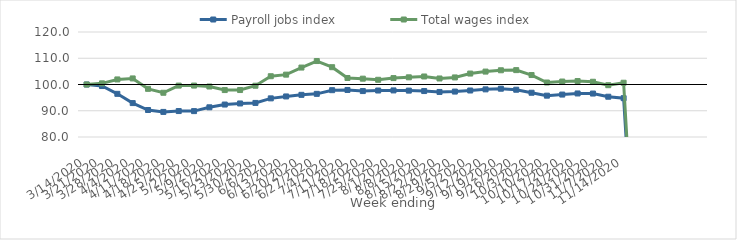
| Category | Payroll jobs index | Total wages index |
|---|---|---|
| 14/03/2020 | 100 | 100 |
| 21/03/2020 | 99.42 | 100.437 |
| 28/03/2020 | 96.446 | 101.93 |
| 04/04/2020 | 92.922 | 102.314 |
| 11/04/2020 | 90.281 | 98.349 |
| 18/04/2020 | 89.555 | 96.856 |
| 25/04/2020 | 89.883 | 99.583 |
| 02/05/2020 | 89.862 | 99.593 |
| 09/05/2020 | 91.313 | 99.234 |
| 16/05/2020 | 92.368 | 97.877 |
| 23/05/2020 | 92.777 | 97.892 |
| 30/05/2020 | 92.98 | 99.53 |
| 06/06/2020 | 94.716 | 103.15 |
| 13/06/2020 | 95.451 | 103.758 |
| 20/06/2020 | 96.061 | 106.455 |
| 27/06/2020 | 96.44 | 108.935 |
| 04/07/2020 | 97.838 | 106.592 |
| 11/07/2020 | 97.922 | 102.476 |
| 18/07/2020 | 97.495 | 102.223 |
| 25/07/2020 | 97.704 | 101.796 |
| 01/08/2020 | 97.75 | 102.439 |
| 08/08/2020 | 97.671 | 102.735 |
| 15/08/2020 | 97.504 | 103.056 |
| 22/08/2020 | 97.164 | 102.292 |
| 29/08/2020 | 97.305 | 102.694 |
| 05/09/2020 | 97.71 | 104.171 |
| 12/09/2020 | 98.148 | 104.921 |
| 19/09/2020 | 98.396 | 105.422 |
| 26/09/2020 | 98.009 | 105.477 |
| 03/10/2020 | 96.86 | 103.604 |
| 10/10/2020 | 95.749 | 100.76 |
| 17/10/2020 | 96.167 | 101.127 |
| 24/10/2020 | 96.589 | 101.31 |
| 31/10/2020 | 96.548 | 101.046 |
| 07/11/2020 | 95.344 | 99.734 |
| 14/11/2020 | 94.795 | 100.67 |